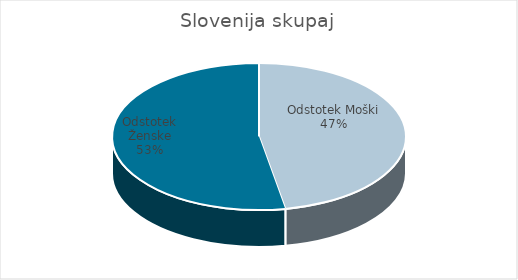
| Category | Slovenija skupaj |
|---|---|
| Odstotek Moški | 24.13 |
| Odstotek Ženske | 27.06 |